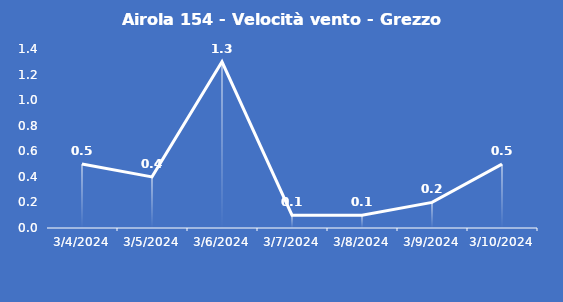
| Category | Airola 154 - Velocità vento - Grezzo (m/s) |
|---|---|
| 3/4/24 | 0.5 |
| 3/5/24 | 0.4 |
| 3/6/24 | 1.3 |
| 3/7/24 | 0.1 |
| 3/8/24 | 0.1 |
| 3/9/24 | 0.2 |
| 3/10/24 | 0.5 |